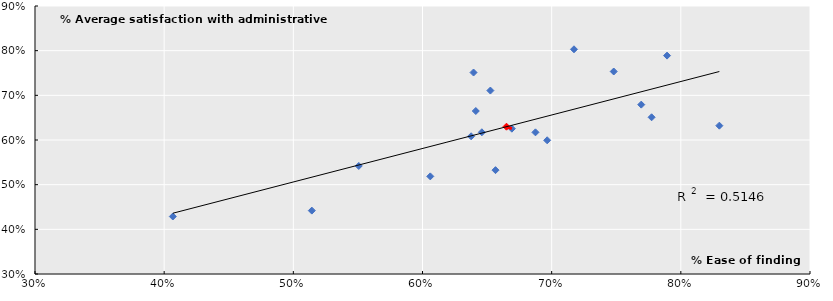
| Category | Average Satisfaction Administrative |
|---|---|
| 0.51431609 | 0.442 |
| 0.40670337 | 0.429 |
| 0.60602473 | 0.519 |
| 0.65652287 | 0.533 |
| 0.5506576 | 0.542 |
| 0.69651153 | 0.599 |
| 0.63763639 | 0.608 |
| 0.68744549 | 0.617 |
| 0.64594461 | 0.617 |
| 0.66919181 | 0.625 |
| 0.665026256842105 | 0.63 |
| 0.82982618 | 0.632 |
| 0.77737417 | 0.651 |
| 0.64125706 | 0.665 |
| 0.76936385 | 0.679 |
| 0.65255257 | 0.711 |
| 0.639508 | 0.751 |
| 0.7480544 | 0.753 |
| 0.78933516 | 0.789 |
| 0.717273 | 0.803 |